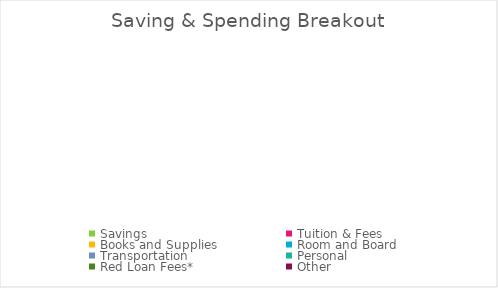
| Category | Series 0 |
|---|---|
| Savings | 0 |
| Tuition & Fees | 0 |
| Books and Supplies | 0 |
| Room and Board | 0 |
| Transportation | 0 |
| Personal | 0 |
| Red Loan Fees* | 0 |
| Other | 0 |